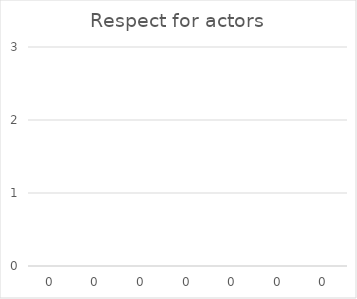
| Category | Respect for actors |
|---|---|
| 0.0 | 0 |
| 0.0 | 0 |
| 0.0 | 0 |
| 0.0 | 0 |
| 0.0 | 0 |
| 0.0 | 0 |
| 0.0 | 0 |